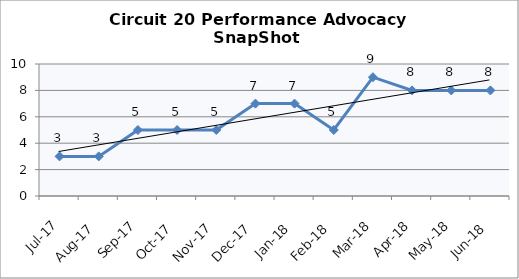
| Category | Circuit 20 |
|---|---|
| Jul-17 | 3 |
| Aug-17 | 3 |
| Sep-17 | 5 |
| Oct-17 | 5 |
| Nov-17 | 5 |
| Dec-17 | 7 |
| Jan-18 | 7 |
| Feb-18 | 5 |
| Mar-18 | 9 |
| Apr-18 | 8 |
| May-18 | 8 |
| Jun-18 | 8 |